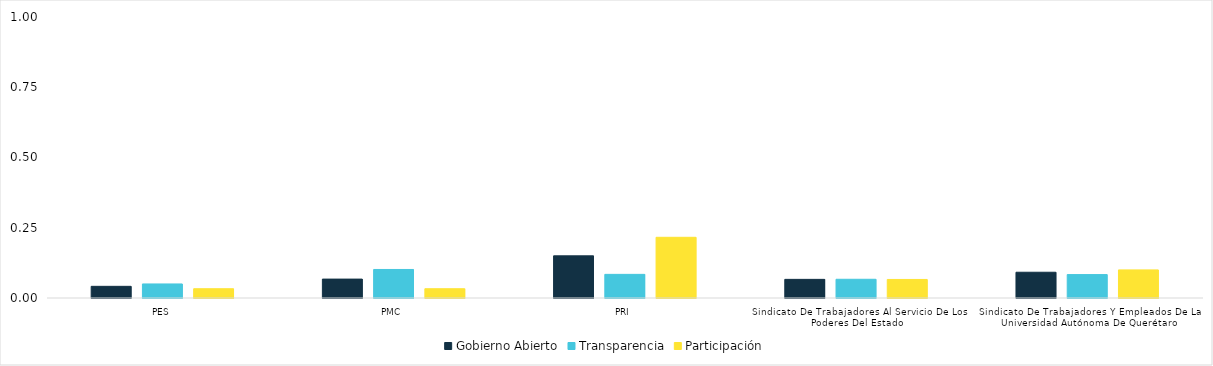
| Category | Gobierno Abierto | Transparencia | Participación |
|---|---|---|---|
| PES | 0.042 | 0.05 | 0.033 |
| PMC | 0.067 | 0.102 | 0.033 |
| PRI | 0.15 | 0.084 | 0.216 |
| Sindicato De Trabajadores Al Servicio De Los Poderes Del Estado | 0.066 | 0.067 | 0.066 |
| Sindicato De Trabajadores Y Empleados De La Universidad Autónoma De Querétaro | 0.092 | 0.083 | 0.1 |